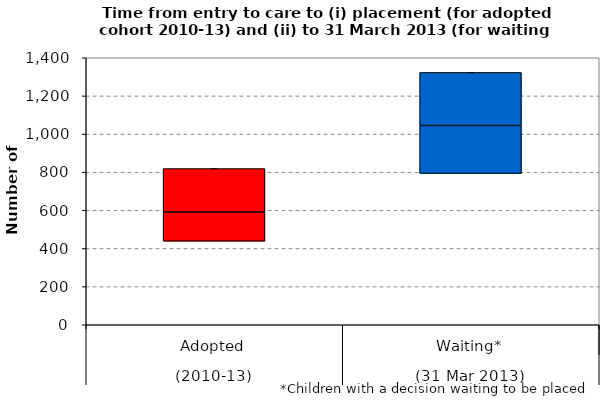
| Category | Series 1 | Series 2 | Series 3 |
|---|---|---|---|
| 0 | 438 | 153 | 228 |
| 1 | 793 | 252 | 278 |